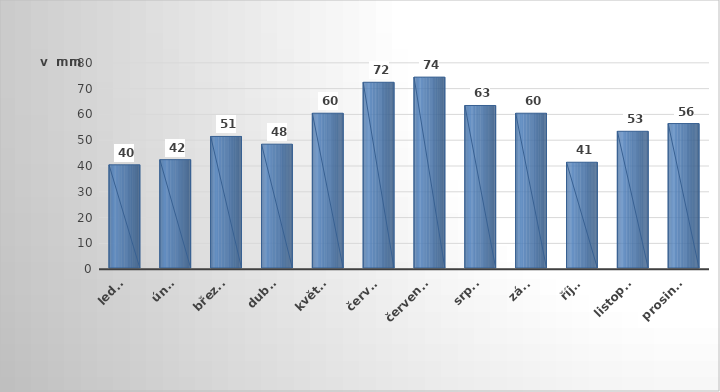
| Category | Series 0 |
|---|---|
| leden | 40 |
| únor | 42 |
| březen | 51 |
| duben | 48 |
| květen | 60 |
| červen | 72 |
| červenec | 74 |
| srpen | 63 |
| září | 60 |
| říjen | 41 |
| listopad | 53 |
| prosinec | 56 |